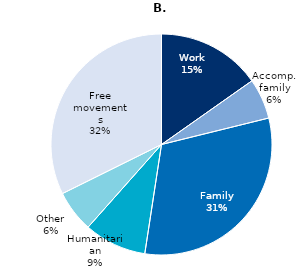
| Category | Series 0 |
|---|---|
| Work | 499341.082 |
| Accomp. family | 193867.538 |
| Family | 1024963.369 |
| Humanitarian | 299538.054 |
| Other | 200611.081 |
| Free movements | 1059474.476 |